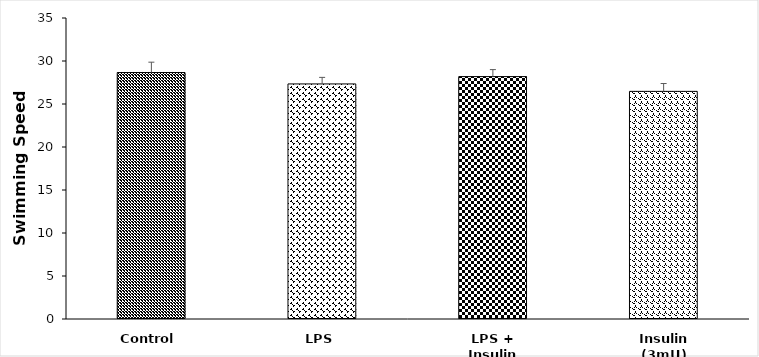
| Category | Control |
|---|---|
| Control | 28.659 |
| LPS | 27.335 |
| LPS + Insulin | 28.188 |
| Insulin (3mU) | 26.469 |